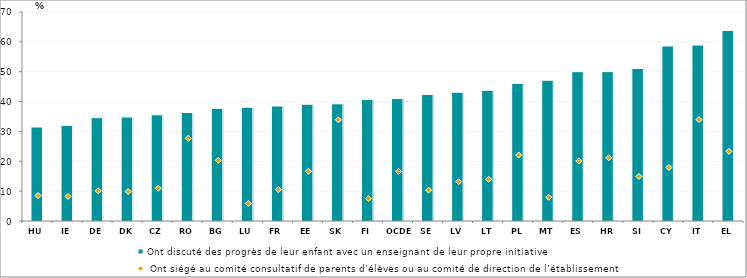
| Category | Ont discuté des progrès de leur enfant avec un enseignant de leur propre initiative |
|---|---|
| HU | 31.476 |
| IE | 32.031 |
| DE | 34.598 |
| DK | 34.837 |
| CZ | 35.569 |
| RO | 36.342 |
| BG | 37.725 |
| LU | 38.132 |
| FR | 38.509 |
| EE | 39.102 |
| SK | 39.256 |
| FI | 40.672 |
| OCDE | 41.013 |
| SE | 42.402 |
| LV | 43.119 |
| LT | 43.77 |
| PL | 46.079 |
| MT | 47.147 |
| ES | 50.023 |
| HR | 50.042 |
| SI | 51.054 |
| CY | 58.62 |
| IT | 58.932 |
| EL | 63.805 |